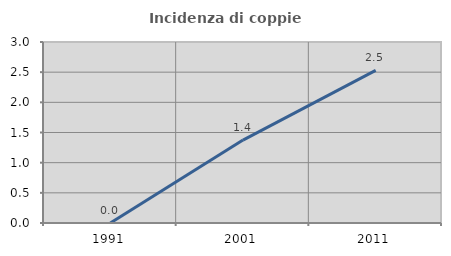
| Category | Incidenza di coppie miste |
|---|---|
| 1991.0 | 0 |
| 2001.0 | 1.374 |
| 2011.0 | 2.53 |